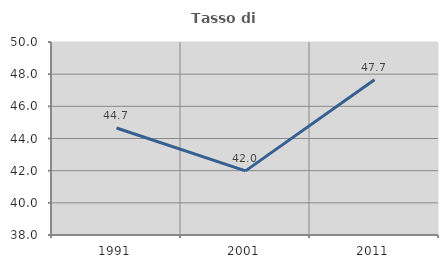
| Category | Tasso di occupazione   |
|---|---|
| 1991.0 | 44.655 |
| 2001.0 | 41.986 |
| 2011.0 | 47.652 |